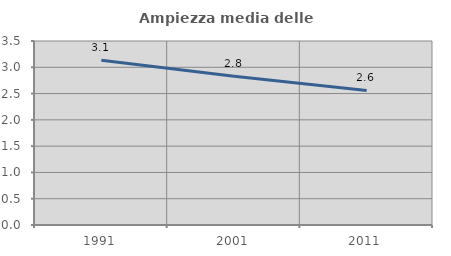
| Category | Ampiezza media delle famiglie |
|---|---|
| 1991.0 | 3.135 |
| 2001.0 | 2.83 |
| 2011.0 | 2.56 |